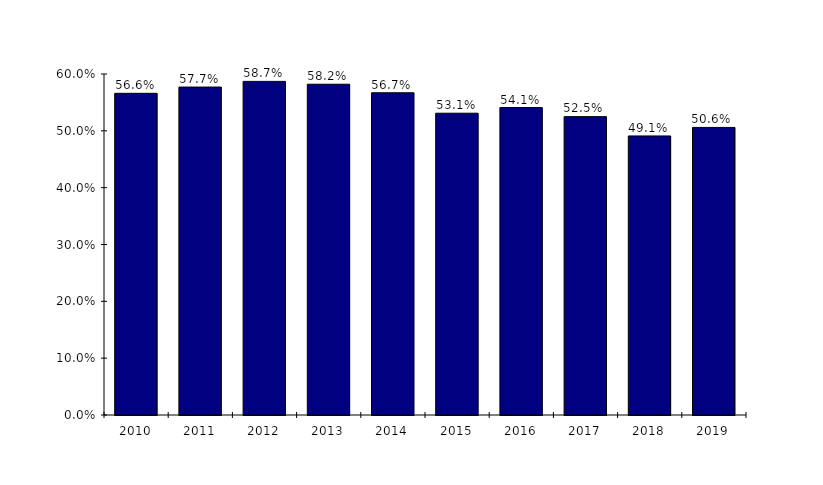
| Category | Series 0 |
|---|---|
| 2010.0 | 0.566 |
| 2011.0 | 0.577 |
| 2012.0 | 0.587 |
| 2013.0 | 0.582 |
| 2014.0 | 0.567 |
| 2015.0 | 0.531 |
| 2016.0 | 0.541 |
| 2017.0 | 0.525 |
| 2018.0 | 0.491 |
| 2019.0 | 0.506 |